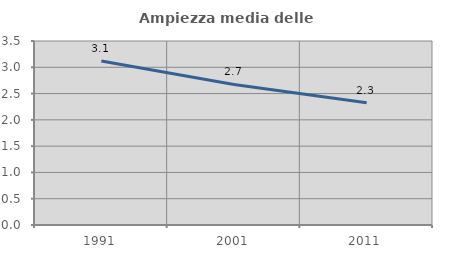
| Category | Ampiezza media delle famiglie |
|---|---|
| 1991.0 | 3.121 |
| 2001.0 | 2.673 |
| 2011.0 | 2.326 |